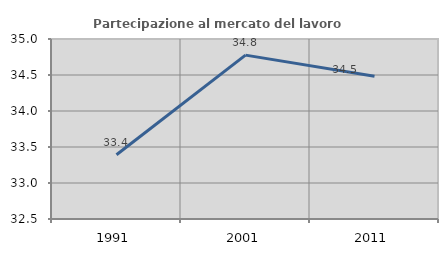
| Category | Partecipazione al mercato del lavoro  femminile |
|---|---|
| 1991.0 | 33.393 |
| 2001.0 | 34.776 |
| 2011.0 | 34.483 |